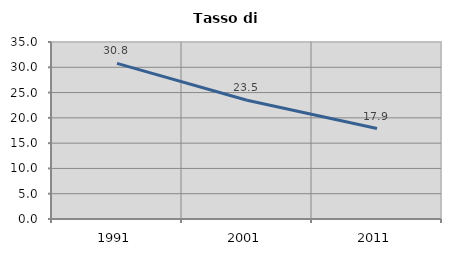
| Category | Tasso di disoccupazione   |
|---|---|
| 1991.0 | 30.783 |
| 2001.0 | 23.491 |
| 2011.0 | 17.889 |